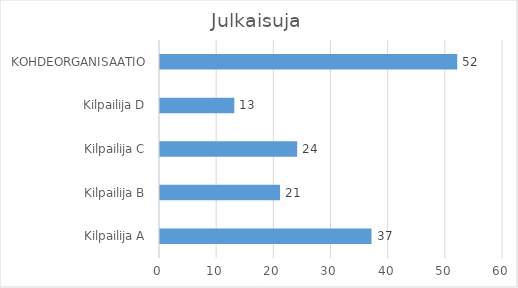
| Category | Series 0 |
|---|---|
| Kilpailija A | 37 |
| Kilpailija B | 21 |
| Kilpailija C | 24 |
| Kilpailija D | 13 |
| KOHDEORGANISAATIO | 52 |